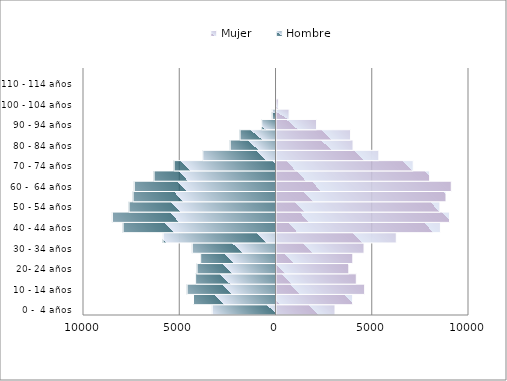
| Category | Hombre | Mujer |
|---|---|---|
| 0 -  4 años | -3313 | 3039 |
| 5 - 9 años | -4285 | 3955 |
| 10 - 14 años | -4616 | 4580 |
| 15 - 19 años | -4176 | 4146 |
| 20- 24 años | -4099 | 3757 |
| 25 - 29 años | -3913 | 3964 |
| 30 - 34 años | -4348 | 4547 |
| 35 - 39 años | -5861 | 6223 |
| 40 - 44 años | -7941 | 8516 |
| 45 - 49 años | -8498 | 8988 |
| 50 - 54 años | -7632 | 8489 |
| 55 - 59 años | -7422 | 8805 |
| 60 -  64 años | -7361 | 9080 |
| 65 - 69 años | -6332 | 7956 |
| 70 - 74 años | -5290 | 7102 |
| 75 - 79 años | -3800 | 5317 |
| 80 - 84 años | -2378 | 3976 |
| 85 -  89 años | -1866 | 3849 |
| 90 - 94 años | -740 | 2081 |
| 95 - 99 años | -192 | 655 |
| 100 - 104 años | -17 | 94 |
| 105 - 109 años | -2 | 9 |
| 110 - 114 años | -1 | 2 |
| 115-119 años | 0 | 1 |